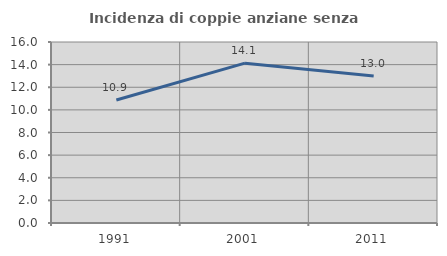
| Category | Incidenza di coppie anziane senza figli  |
|---|---|
| 1991.0 | 10.87 |
| 2001.0 | 14.13 |
| 2011.0 | 13 |